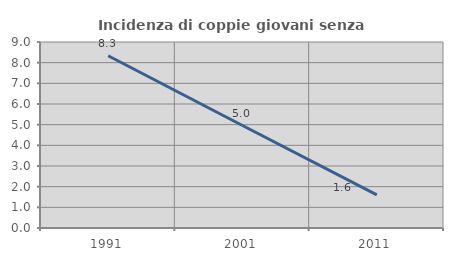
| Category | Incidenza di coppie giovani senza figli |
|---|---|
| 1991.0 | 8.333 |
| 2001.0 | 4.959 |
| 2011.0 | 1.6 |